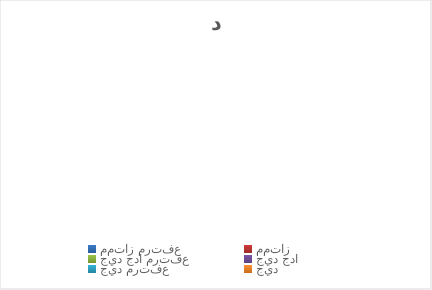
| Category | العدد |
|---|---|
| ممتاز مرتفع | 0 |
| ممتاز  | 0 |
| جيد جدا مرتفع | 0 |
| جيد جدا | 0 |
| جيد مرتفع | 0 |
| جيد | 0 |